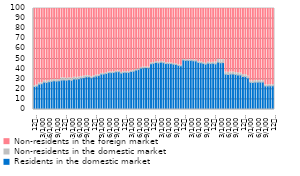
| Category | Residents in the domestic market | Non-residents in the domestic market | Non-residents in the foreign market |
|---|---|---|---|
| 12
2013 | 22.746 | 0.884 | 76.37 |
| 1 | 23.113 | 1.21 | 75.676 |
| 2 | 25.082 | 1.193 | 73.725 |
| 3 | 25.523 | 1.082 | 73.395 |
| 4 | 27.022 | 1.419 | 71.559 |
| 5 | 26.732 | 1.389 | 71.879 |
| 6 | 27.449 | 1.371 | 71.18 |
| 7 | 27.865 | 1.314 | 70.821 |
| 8 | 28.399 | 1.263 | 70.338 |
| 9 | 28.112 | 1.261 | 70.627 |
| 10 | 28.396 | 1.308 | 70.296 |
| 11 | 29.056 | 2.275 | 68.669 |
| 12
2014 | 29.222 | 2.157 | 68.621 |
| 1 | 28.996 | 1.846 | 69.158 |
| 2 | 29.375 | 2.156 | 68.469 |
| 3 | 28.86 | 2.123 | 69.017 |
| 4 | 30.112 | 1.915 | 67.972 |
| 5 | 30.094 | 1.642 | 68.263 |
| 6 | 30.54 | 1.666 | 67.794 |
| 7 | 31.186 | 1.524 | 67.29 |
| 8 | 31.557 | 1.585 | 66.858 |
| 9 | 32.403 | 1.199 | 66.398 |
| 10 | 32.369 | 1.176 | 66.455 |
| 11 | 31.432 | 1.144 | 67.424 |
| 12
2015 | 32.295 | 1.065 | 66.64 |
| 1 | 33.081 | 1.013 | 65.907 |
| 2 | 33.56 | 0.847 | 65.593 |
| 3 | 35.045 | 0.74 | 64.216 |
| 4 | 35.12 | 0.702 | 64.177 |
| 5 | 35.666 | 0.849 | 63.484 |
| 6 | 36.486 | 0.776 | 62.739 |
| 7 | 36.47 | 0.751 | 62.779 |
| 8 | 36.672 | 0.676 | 62.652 |
| 9 | 37.327 | 0.673 | 62 |
| 10 | 37.415 | 0.656 | 61.929 |
| 11 | 35.998 | 0.759 | 63.243 |
| 12
2016 | 36.713 | 0.701 | 62.586 |
| 1 | 36.757 | 0.676 | 62.567 |
| 2 | 36.741 | 0.675 | 62.584 |
| 3 | 37.619 | 0.726 | 61.655 |
| 4 | 37.923 | 0.745 | 61.332 |
| 5 | 38.982 | 0.741 | 60.277 |
| 6 | 39.517 | 0.655 | 59.828 |
| 7 | 41.023 | 0.695 | 58.282 |
| 8 | 41.301 | 0.699 | 58 |
| 9 | 41.537 | 0.776 | 57.687 |
| 10 | 41.277 | 0.747 | 57.976 |
| 11 | 45.37 | 0.839 | 53.792 |
| 12
2017 | 45.716 | 0.72 | 53.564 |
| 1 | 46.55 | 0.973 | 52.477 |
| 2 | 46.09 | 0.947 | 52.964 |
| 3 | 46.816 | 0.875 | 52.308 |
| 4 | 46.346 | 0.82 | 52.834 |
| 5 | 45.455 | 0.786 | 53.759 |
| 6 | 45.49 | 0.789 | 53.721 |
| 7 | 45.446 | 0.714 | 53.841 |
| 8 | 44.864 | 0.694 | 54.443 |
| 9 | 44.608 | 0.681 | 54.711 |
| 10 | 43.66 | 0.664 | 55.676 |
| 11 | 43.209 | 0.625 | 56.166 |
| 12
2018 | 49.022 | 0.553 | 50.425 |
| 1 | 48.569 | 0.551 | 50.879 |
| 2 | 48.613 | 0.653 | 50.735 |
| 3 | 48.634 | 0.688 | 50.678 |
| 4 | 48.22 | 0.694 | 51.086 |
| 5 | 48.072 | 0.822 | 51.106 |
| 6 | 46.599 | 0.971 | 52.429 |
| 7 | 46.234 | 0.958 | 52.808 |
| 8 | 45.641 | 0.929 | 53.43 |
| 9 | 44.859 | 0.936 | 54.205 |
| 10 | 45.829 | 1.104 | 53.067 |
| 11 | 45.494 | 1.096 | 53.409 |
| 12
2019 | 45.723 | 1.083 | 53.194 |
| 1 | 45.119 | 1.918 | 52.963 |
| 2 | 46.867 | 2.973 | 50.16 |
| 3 | 46.256 | 2.918 | 50.827 |
| 4 | 46.459 | 2.887 | 50.653 |
| 5 | 34.989 | 2.119 | 62.892 |
| 6 | 34.742 | 2.07 | 63.188 |
| 7 | 35.109 | 2.074 | 62.816 |
| 8 | 35.162 | 1.948 | 62.89 |
| 9 | 34.685 | 1.931 | 63.384 |
| 10 | 34.23 | 1.946 | 63.824 |
| 11 | 34.153 | 1.978 | 63.87 |
| 12
2020 | 32.65 | 1.904 | 65.446 |
| 1 | 32.622 | 1.896 | 65.483 |
| 2 | 31.301 | 1.829 | 66.87 |
| 3 | 26.919 | 1.418 | 71.664 |
| 4 | 26.736 | 1.448 | 71.816 |
| 5 | 27.091 | 1.564 | 71.344 |
| 6 | 27.081 | 1.527 | 71.391 |
| 7 | 27.153 | 1.525 | 71.321 |
| 8 | 27.135 | 1.444 | 71.421 |
| 9 | 23.294 | 1.129 | 75.577 |
| 10 | 23.32 | 1.103 | 75.577 |
| 11 | 23.426 | 1.116 | 75.457 |
| 12
2021 | 23.469 | 1.074 | 75.457 |